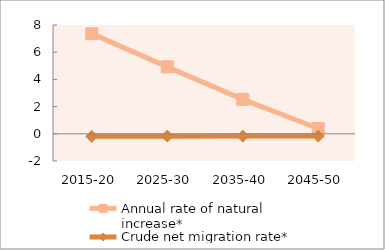
| Category | Annual rate of natural increase* | Crude net migration rate* |
|---|---|---|
| 2015-20 | 7.363 | -0.183 |
| 2025-30 | 4.923 | -0.173 |
| 2035-40 | 2.529 | -0.167 |
| 2045-50 | 0.39 | -0.165 |